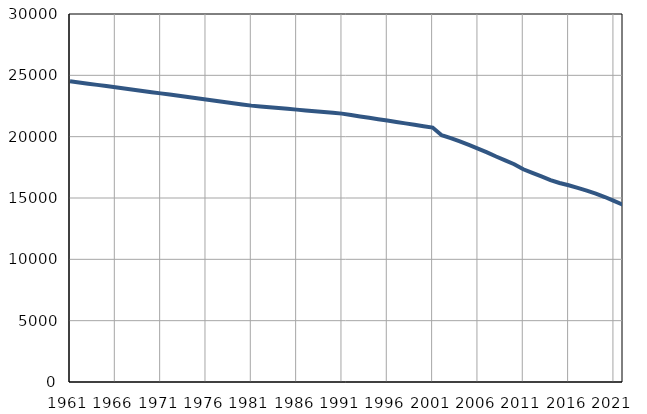
| Category | Број
становника |
|---|---|
| 1961.0 | 24520 |
| 1962.0 | 24421 |
| 1963.0 | 24322 |
| 1964.0 | 24223 |
| 1965.0 | 24124 |
| 1966.0 | 24024 |
| 1967.0 | 23925 |
| 1968.0 | 23826 |
| 1969.0 | 23727 |
| 1970.0 | 23628 |
| 1971.0 | 23529 |
| 1972.0 | 23430 |
| 1973.0 | 23330 |
| 1974.0 | 23229 |
| 1975.0 | 23129 |
| 1976.0 | 23030 |
| 1977.0 | 22930 |
| 1978.0 | 22830 |
| 1979.0 | 22730 |
| 1980.0 | 22630 |
| 1981.0 | 22530 |
| 1982.0 | 22465 |
| 1983.0 | 22400 |
| 1984.0 | 22335 |
| 1985.0 | 22270 |
| 1986.0 | 22205 |
| 1987.0 | 22139 |
| 1988.0 | 22074 |
| 1989.0 | 22009 |
| 1990.0 | 21943 |
| 1991.0 | 21879 |
| 1992.0 | 21764 |
| 1993.0 | 21651 |
| 1994.0 | 21537 |
| 1995.0 | 21424 |
| 1996.0 | 21310 |
| 1997.0 | 21198 |
| 1998.0 | 21083 |
| 1999.0 | 20970 |
| 2000.0 | 20856 |
| 2001.0 | 20743 |
| 2002.0 | 20123 |
| 2003.0 | 19883 |
| 2004.0 | 19620 |
| 2005.0 | 19334 |
| 2006.0 | 19032 |
| 2007.0 | 18722 |
| 2008.0 | 18381 |
| 2009.0 | 18071 |
| 2010.0 | 17751 |
| 2011.0 | 17344 |
| 2012.0 | 17046 |
| 2013.0 | 16760 |
| 2014.0 | 16459 |
| 2015.0 | 16226 |
| 2016.0 | 16038 |
| 2017.0 | 15825 |
| 2018.0 | 15602 |
| 2019.0 | 15358 |
| 2020.0 | 15079 |
| 2021.0 | 14759 |
| 2022.0 | 14450 |